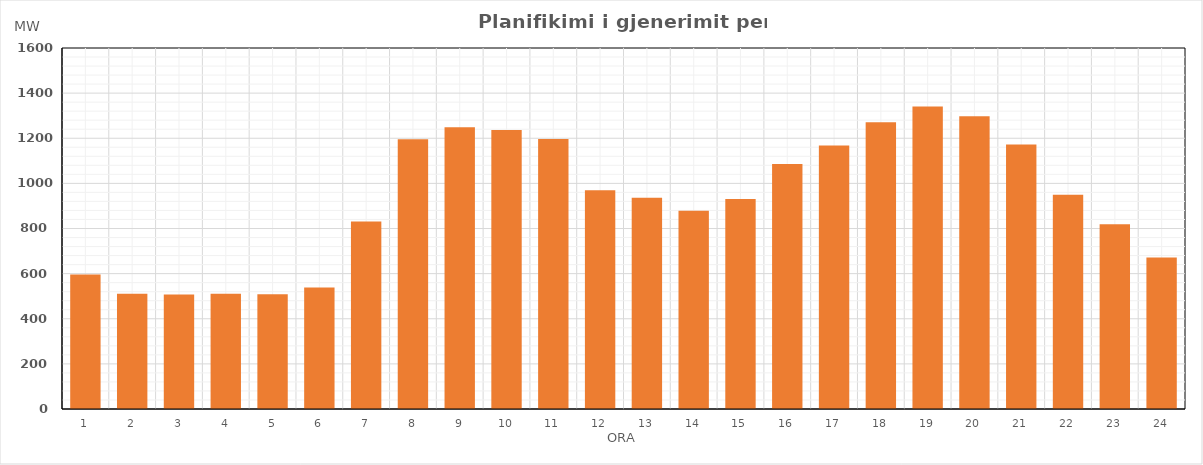
| Category | Max (MW) |
|---|---|
| 0 | 596.56 |
| 1 | 510.46 |
| 2 | 507.86 |
| 3 | 511.03 |
| 4 | 508.72 |
| 5 | 538.01 |
| 6 | 831.42 |
| 7 | 1195.53 |
| 8 | 1248.64 |
| 9 | 1236.74 |
| 10 | 1196.36 |
| 11 | 968.99 |
| 12 | 936.13 |
| 13 | 878.51 |
| 14 | 930.7 |
| 15 | 1086.13 |
| 16 | 1167.97 |
| 17 | 1270.61 |
| 18 | 1340.94 |
| 19 | 1297.82 |
| 20 | 1172.79 |
| 21 | 949.97 |
| 22 | 819.08 |
| 23 | 671.87 |